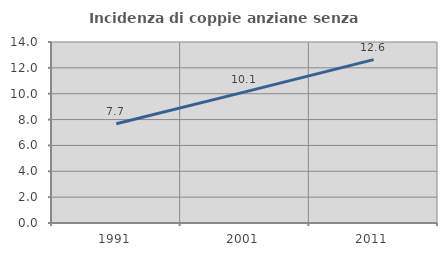
| Category | Incidenza di coppie anziane senza figli  |
|---|---|
| 1991.0 | 7.681 |
| 2001.0 | 10.139 |
| 2011.0 | 12.637 |